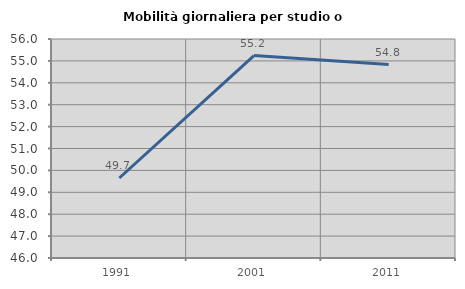
| Category | Mobilità giornaliera per studio o lavoro |
|---|---|
| 1991.0 | 49.653 |
| 2001.0 | 55.246 |
| 2011.0 | 54.83 |